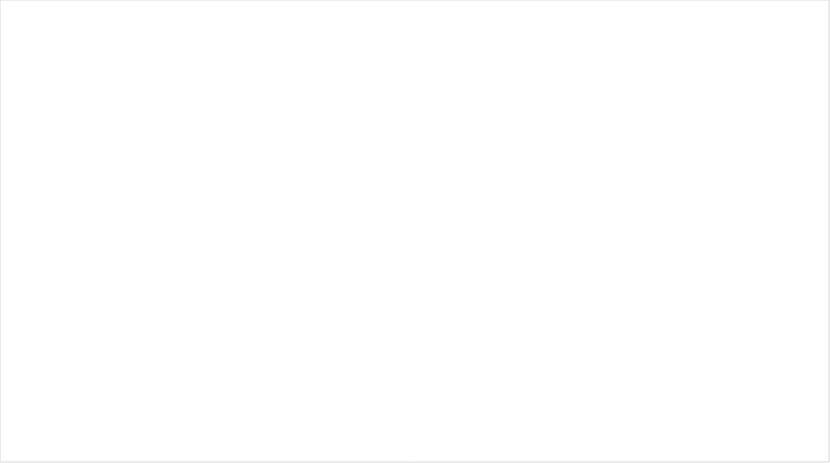
| Category |  APROPIACION
 VIGENTE |  COMPROMISOS
 ACUMULADOS |  OBLIGACIONES
 ACUMULADAS |  PAGOS
 ACUMULADOS |
|---|---|---|---|---|
| A-01 -GASTOS DE PERSONAL | 51464.345 | 27499.383 | 27499.383 | 26609.221 |
| A-02 -ADQUISICIÓN DE BIENES  Y SERVICIOS | 19419.071 | 15785.038 | 9648.995 | 9643.739 |
| A-03-TRANSFERENCIAS CORRIENTES | 14851.097 | 1420.003 | 1416.104 | 1416.104 |
| A-08-GASTOS POR TRIBUTOS, MULTAS, SANCIONES E INTERESES DE MORA | 14051.472 | 0 | 0 | 0 |